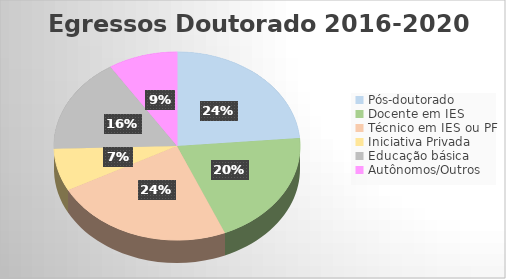
| Category | Series 0 |
|---|---|
| Pós-doutorado | 13 |
| Docente em IES | 11 |
| Técnico em IES ou PF | 13 |
| Iniciativa Privada | 4 |
| Educação básica | 9 |
| Autônomos/Outros | 5 |